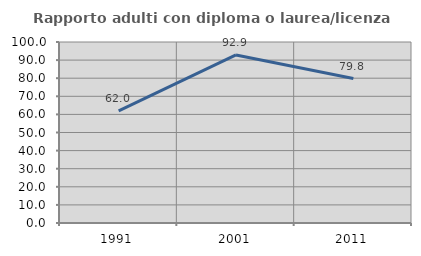
| Category | Rapporto adulti con diploma o laurea/licenza media  |
|---|---|
| 1991.0 | 61.993 |
| 2001.0 | 92.868 |
| 2011.0 | 79.828 |